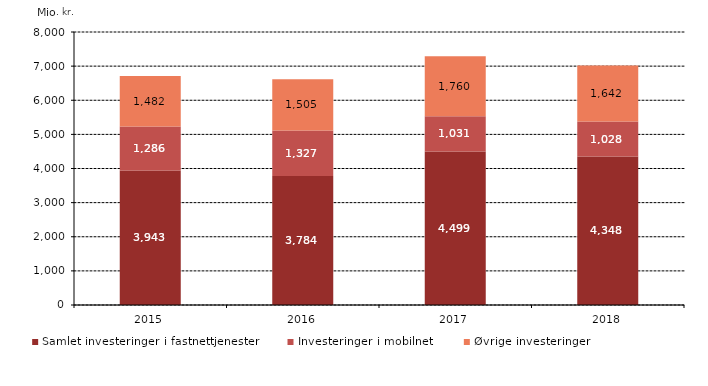
| Category | Samlet investeringer i fastnettjenester | Investeringer i mobilnet | Øvrige investeringer |
|---|---|---|---|
| 2015.0 | 3942.948 | 1286.307 | 1482.137 |
| 2016.0 | 3783.652 | 1326.949 | 1504.618 |
| 2017.0 | 4498.828 | 1030.872 | 1759.903 |
| 2018.0 | 4348.459 | 1028.402 | 1642.213 |